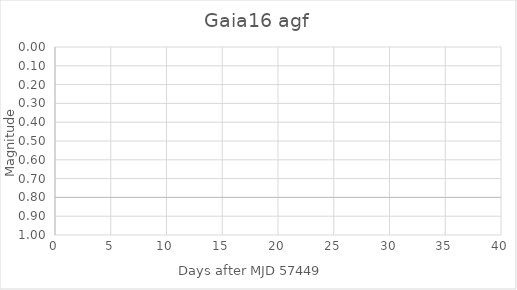
| Category | Series 1 |
|---|---|
| 1.3197000000000116 | 0 |
| 2.2770000000018626 | 0 |
| 4.274299999997311 | 0 |
| 8.230300000002899 | 0 |
| 10.257799999999406 | 0 |
| 12.230300000002899 | 0 |
| 13.286599999999453 | 0 |
| 15.319100000000617 | 0 |
| 17.276400000002468 | 0 |
| 19.293299999997544 | 0 |
| 20.286299999999756 | 0 |
| 21.278200000000652 | 0 |
| 26.23410000000149 | 0 |
| 27.248599999998987 | 0 |
| 32.23670000000129 | 0 |
| 34.41849999999977 | 0 |